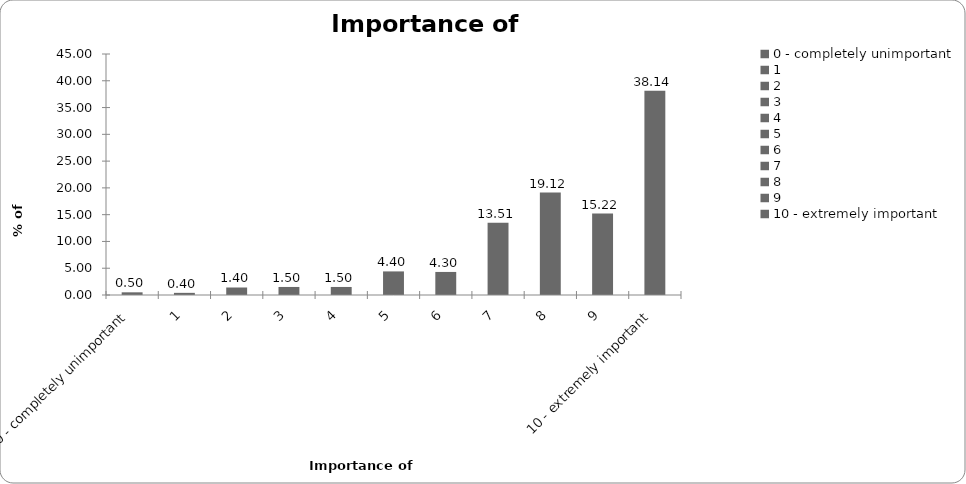
| Category | Importance of insurance |
|---|---|
| 0 - completely unimportant | 0.501 |
| 1 | 0.4 |
| 2 | 1.401 |
| 3 | 1.502 |
| 4 | 1.502 |
| 5 | 4.404 |
| 6 | 4.304 |
| 7 | 13.514 |
| 8 | 19.119 |
| 9 | 15.215 |
| 10 - extremely important | 38.138 |